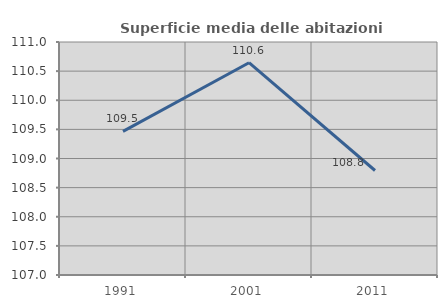
| Category | Superficie media delle abitazioni occupate |
|---|---|
| 1991.0 | 109.466 |
| 2001.0 | 110.644 |
| 2011.0 | 108.794 |